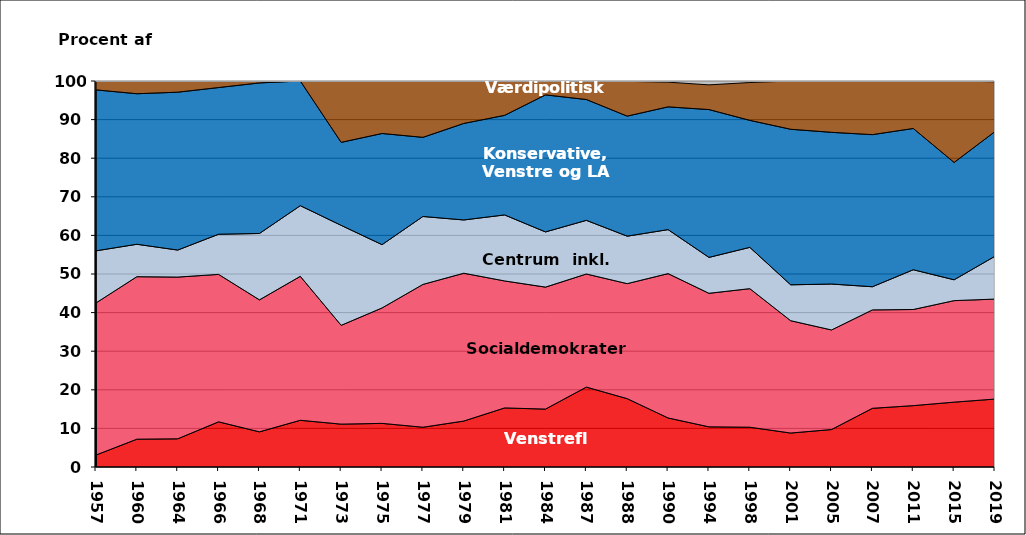
| Category | Venstrefløj | Socialdemokraterne | Centrum  inkl. Radikale | Konservative, Venstre og LA | Værdi-politisk højre |
|---|---|---|---|---|---|
| 1957.0 | 3.1 | 39.4 | 13.5 | 41.7 | 2.3 |
| 1960.0 | 7.2 | 42.1 | 8.4 | 39 | 3.3 |
| 1964.0 | 7.3 | 41.9 | 7 | 40.9 | 2.9 |
| 1966.0 | 11.7 | 38.2 | 10.4 | 38 | 1.6 |
| 1968.0 | 9.1 | 34.2 | 17.2 | 39 | 0.5 |
| 1971.0 | 12.1 | 37.3 | 18.3 | 32.3 | 0 |
| 1973.0 | 11.1 | 25.6 | 25.9 | 21.5 | 15.9 |
| 1975.0 | 11.3 | 29.9 | 16.4 | 28.8 | 13.6 |
| 1977.0 | 10.3 | 37 | 17.6 | 20.5 | 14.6 |
| 1979.0 | 11.9 | 38.3 | 13.8 | 25 | 11 |
| 1981.0 | 15.3 | 32.9 | 17.1 | 25.8 | 8.9 |
| 1984.0 | 15 | 31.6 | 14.3 | 35.5 | 3.6 |
| 1987.0 | 20.7 | 29.3 | 13.9 | 31.3 | 4.8 |
| 1988.0 | 17.7 | 29.8 | 12.3 | 31.1 | 9 |
| 1990.0 | 12.7 | 37.4 | 11.4 | 31.8 | 6.4 |
| 1994.0 | 10.4 | 34.6 | 9.3 | 38.3 | 6.4 |
| 1998.0 | 10.3 | 35.9 | 10.7 | 32.9 | 9.8 |
| 2001.0 | 8.8 | 29.1 | 9.3 | 40.3 | 12.5 |
| 2005.0 | 9.7 | 25.8 | 11.9 | 39.3 | 13.3 |
| 2007.0 | 15.2 | 25.5 | 6 | 39.4 | 13.9 |
| 2011.0 | 15.9 | 24.9 | 10.3 | 36.6 | 12.3 |
| 2015.0 | 16.8 | 26.3 | 5.4 | 30.4 | 21.1 |
| 2019.0 | 17.6 | 25.9 | 11.1 | 32.3 | 12.9 |